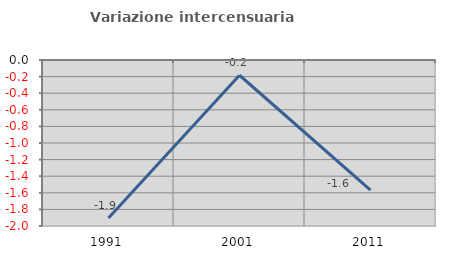
| Category | Variazione intercensuaria annua |
|---|---|
| 1991.0 | -1.903 |
| 2001.0 | -0.184 |
| 2011.0 | -1.568 |